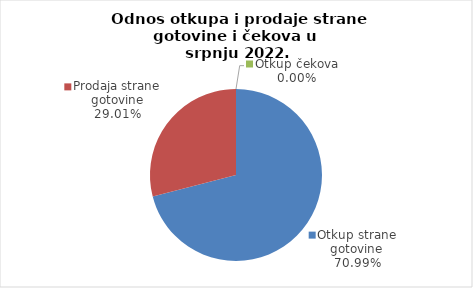
| Category | Series 0 |
|---|---|
| Otkup strane gotovine | 70.995 |
| Prodaja strane gotovine | 29.005 |
| Otkup čekova | 0 |